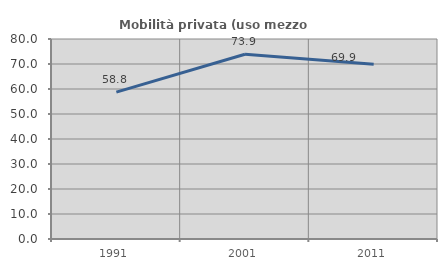
| Category | Mobilità privata (uso mezzo privato) |
|---|---|
| 1991.0 | 58.768 |
| 2001.0 | 73.918 |
| 2011.0 | 69.886 |